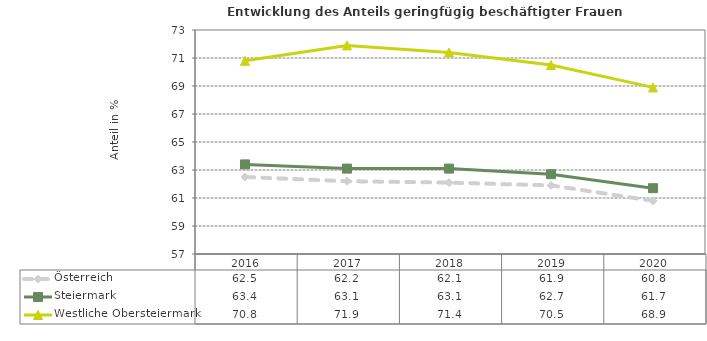
| Category | Österreich | Steiermark | Westliche Obersteiermark |
|---|---|---|---|
| 2020.0 | 60.8 | 61.7 | 68.9 |
| 2019.0 | 61.9 | 62.7 | 70.5 |
| 2018.0 | 62.1 | 63.1 | 71.4 |
| 2017.0 | 62.2 | 63.1 | 71.9 |
| 2016.0 | 62.5 | 63.4 | 70.8 |